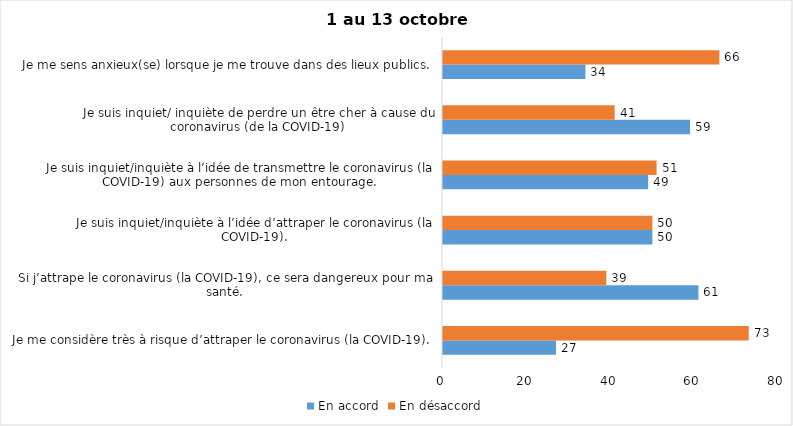
| Category | En accord | En désaccord |
|---|---|---|
| Je me considère très à risque d’attraper le coronavirus (la COVID-19). | 27 | 73 |
| Si j’attrape le coronavirus (la COVID-19), ce sera dangereux pour ma santé. | 61 | 39 |
| Je suis inquiet/inquiète à l’idée d’attraper le coronavirus (la COVID-19). | 50 | 50 |
| Je suis inquiet/inquiète à l’idée de transmettre le coronavirus (la COVID-19) aux personnes de mon entourage. | 49 | 51 |
| Je suis inquiet/ inquiète de perdre un être cher à cause du coronavirus (de la COVID-19) | 59 | 41 |
| Je me sens anxieux(se) lorsque je me trouve dans des lieux publics. | 34 | 66 |